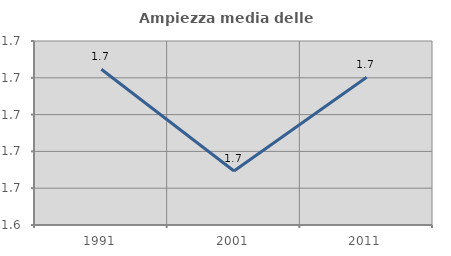
| Category | Ampiezza media delle famiglie |
|---|---|
| 1991.0 | 1.725 |
| 2001.0 | 1.669 |
| 2011.0 | 1.72 |